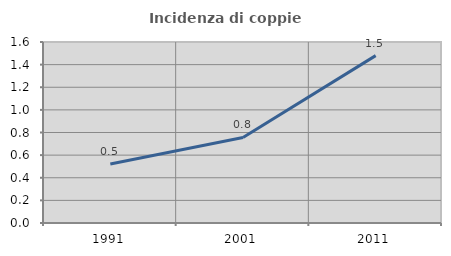
| Category | Incidenza di coppie miste |
|---|---|
| 1991.0 | 0.521 |
| 2001.0 | 0.756 |
| 2011.0 | 1.48 |